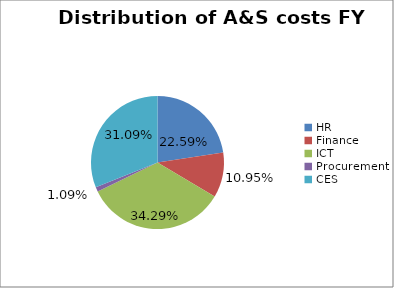
| Category | Distribution of A&S costs FY 2012/13 |
|---|---|
| HR | 0.226 |
| Finance | 0.109 |
| ICT | 0.343 |
| Procurement | 0.011 |
| CES | 0.311 |